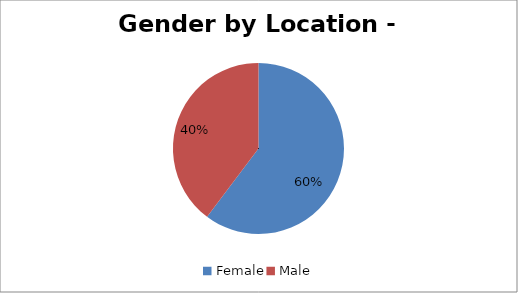
| Category | London |
|---|---|
| Female | 763 |
| Male | 503 |